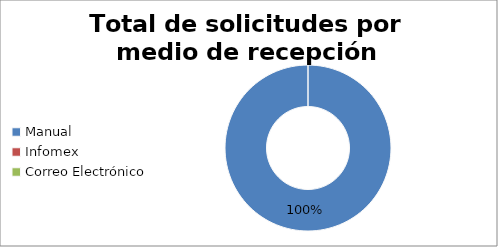
| Category | totales |
|---|---|
| Manual | 4 |
| Infomex | 0 |
| Correo Electrónico | 0 |